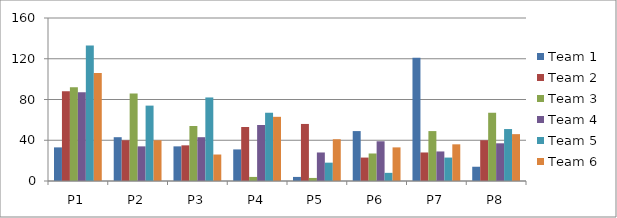
| Category | Team 1 | Team 2 | Team 3 | Team 4 | Team 5 | Team 6 |
|---|---|---|---|---|---|---|
| P1 | 33 | 88 | 92 | 87 | 133 | 106 |
| P2 | 43 | 40 | 86 | 34 | 74 | 40 |
| P3 | 34 | 35 | 54 | 43 | 82 | 26 |
| P4 | 31 | 53 | 4 | 55 | 67 | 63 |
| P5 | 4 | 56 | 3 | 28 | 18 | 41 |
| P6 | 49 | 23 | 27 | 39 | 8 | 33 |
| P7 | 121 | 28 | 49 | 29 | 23 | 36 |
| P8 | 14 | 40 | 67 | 37 | 51 | 46 |